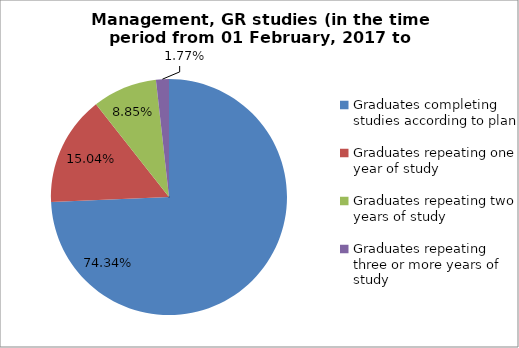
| Category | Series 0 |
|---|---|
| Graduates completing studies according to plan | 74.336 |
| Graduates repeating one year of study | 15.044 |
| Graduates repeating two years of study | 8.85 |
| Graduates repeating three or more years of study | 1.77 |